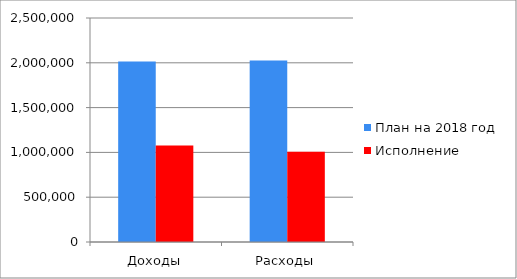
| Category | План на 2018 год | Исполнение |
|---|---|---|
| Доходы | 2013502.9 | 1075904 |
| Расходы | 2027032 | 1007290 |